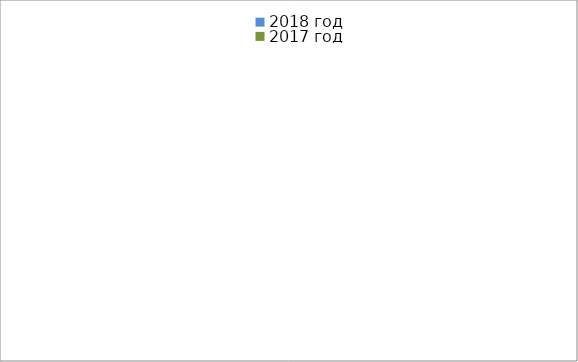
| Category | 2018 год | 2017 год |
|---|---|---|
|  - поджог | 14 | 19 |
|  - неосторожное обращение с огнём | 13 | 6 |
|  - НПТЭ электрооборудования | 17 | 24 |
|  - НПУ и Э печей | 62 | 50 |
|  - НПУ и Э транспортных средств | 42 | 44 |
|   -Шалость с огнем детей | 4 | 4 |
|  -НППБ при эксплуатации эл.приборов | 15 | 27 |
|  - курение | 31 | 35 |
| - прочие | 57 | 67 |
| - не установленные причины | 0 | 0 |